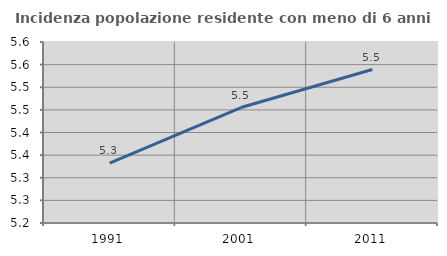
| Category | Incidenza popolazione residente con meno di 6 anni |
|---|---|
| 1991.0 | 5.332 |
| 2001.0 | 5.455 |
| 2011.0 | 5.539 |